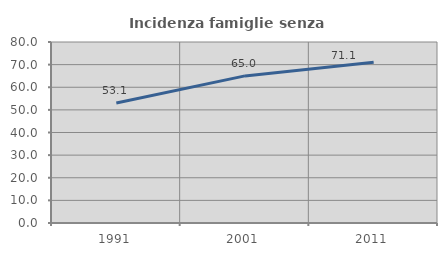
| Category | Incidenza famiglie senza nuclei |
|---|---|
| 1991.0 | 53.061 |
| 2001.0 | 65.019 |
| 2011.0 | 71.08 |